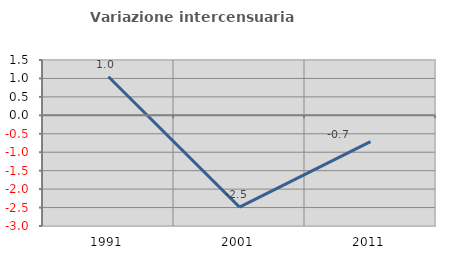
| Category | Variazione intercensuaria annua |
|---|---|
| 1991.0 | 1.045 |
| 2001.0 | -2.489 |
| 2011.0 | -0.714 |